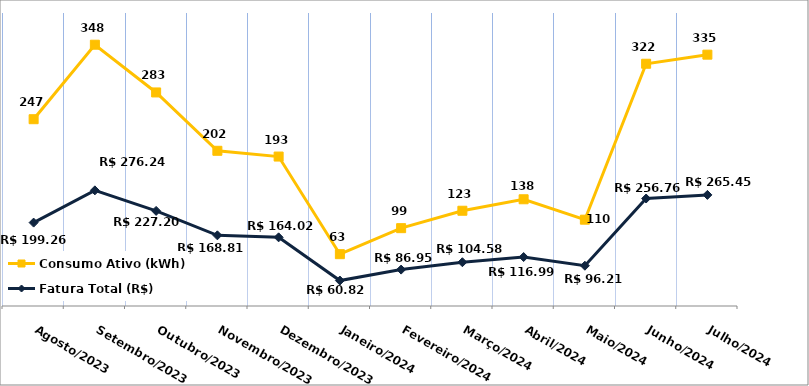
| Category | Fatura Total (R$) | Consumo Ativo (kWh) |
|---|---|---|
| Agosto/2023 | 199.26 | 247 |
| Setembro/2023 | 276.24 | 348 |
| Outubro/2023 | 227.2 | 283 |
| Novembro/2023 | 168.81 | 202 |
| Dezembro/2023 | 164.02 | 193 |
| Janeiro/2024 | 60.82 | 63 |
| Fevereiro/2024 | 86.95 | 99 |
| Março/2024 | 104.58 | 123 |
| Abril/2024 | 116.99 | 138 |
| Maio/2024 | 96.21 | 110 |
| Junho/2024 | 256.76 | 322 |
| Julho/2024 | 265.45 | 335 |